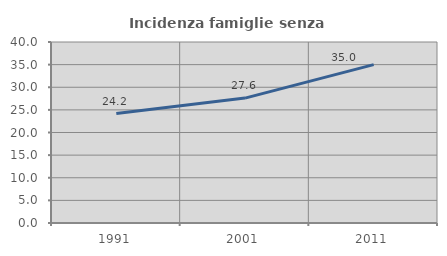
| Category | Incidenza famiglie senza nuclei |
|---|---|
| 1991.0 | 24.183 |
| 2001.0 | 27.602 |
| 2011.0 | 35.01 |